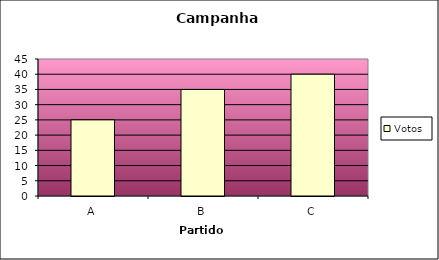
| Category | Votos |
|---|---|
| A | 25 |
| B | 35 |
| C | 40 |